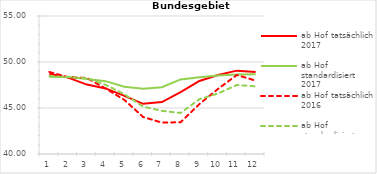
| Category | ab Hof tatsächlich 2017 | ab Hof standardisiert 2017 | ab Hof tatsächlich 2016 | ab Hof standardisiert 2016 |
|---|---|---|---|---|
| 0 | 48.725 | 48.386 | 48.914 | 48.451 |
| 1 | 48.3 | 48.36 | 48.356 | 48.371 |
| 2 | 47.543 | 48.157 | 48.269 | 48.239 |
| 3 | 47.126 | 47.92 | 47.121 | 47.519 |
| 4 | 46.324 | 47.318 | 45.879 | 46.488 |
| 5 | 45.456 | 47.089 | 44.022 | 45.148 |
| 6 | 45.648 | 47.264 | 43.411 | 44.692 |
| 7 | 46.716 | 48.106 | 43.453 | 44.457 |
| 8 | 47.937 | 48.344 | 45.423 | 45.956 |
| 9 | 48.586 | 48.541 | 47.083 | 46.582 |
| 10 | 49.06 | 48.634 | 48.588 | 47.501 |
| 11 | 48.904 | 48.658 | 47.973 | 47.353 |